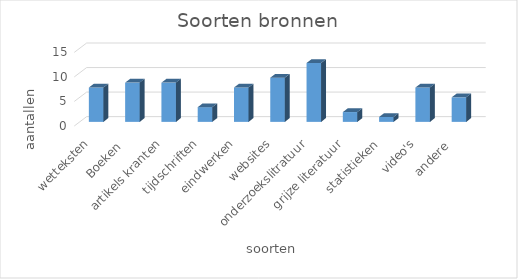
| Category | Series 0 |
|---|---|
| wetteksten | 7 |
| Boeken  | 8 |
| artikels kranten | 8 |
| tijdschriften | 3 |
| eindwerken | 7 |
| websites | 9 |
| onderzoekslitratuur | 12 |
| grijze literatuur | 2 |
| statistieken | 1 |
| video's | 7 |
| andere  | 5 |